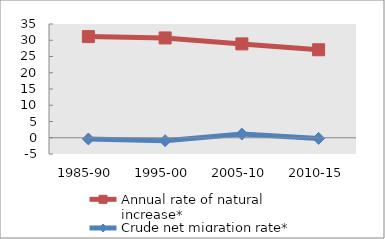
| Category | Annual rate of natural increase* | Crude net migration rate* |
|---|---|---|
| 1985-90 | 31.123 | -0.376 |
| 1995-00 | 30.707 | -0.906 |
| 2005-10 | 28.882 | 1.13 |
| 2010-15 | 27.074 | -0.196 |